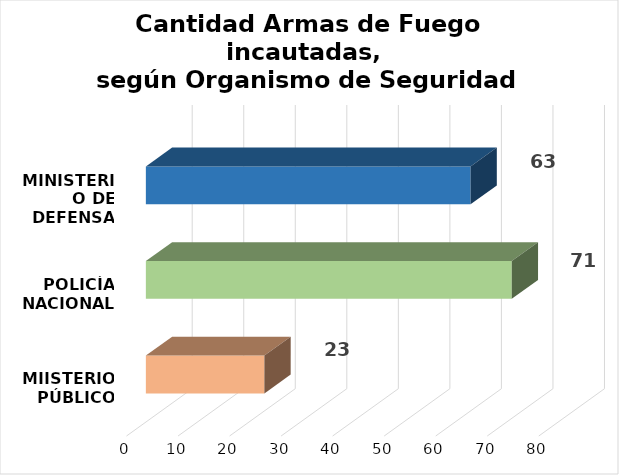
| Category | Series 0 |
|---|---|
| MIISTERIO PÚBLICO | 23 |
| POLICÍA NACIONAL | 71 |
| MINISTERIO DE DEFENSA | 63 |